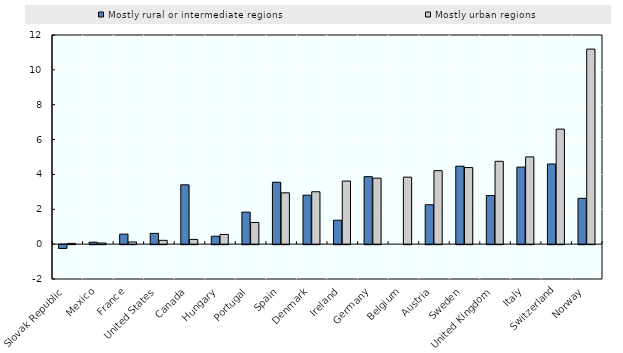
| Category | Mostly rural or intermediate regions | Mostly urban regions |
|---|---|---|
| Slovak Republic | -0.218 | 0.043 |
| Mexico | 0.111 | 0.065 |
| France | 0.574 | 0.125 |
| United States | 0.617 | 0.22 |
| Canada | 3.403 | 0.27 |
| Hungary | 0.454 | 0.557 |
| Portugal | 1.836 | 1.244 |
| Spain | 3.553 | 2.944 |
| Denmark | 2.809 | 3.005 |
| Ireland | 1.371 | 3.619 |
| Germany | 3.872 | 3.785 |
| Belgium | 0 | 3.844 |
| Austria | 2.261 | 4.217 |
| Sweden | 4.473 | 4.394 |
| United Kingdom | 2.79 | 4.753 |
| Italy | 4.42 | 5.007 |
| Switzerland | 4.598 | 6.6 |
| Norway | 2.629 | 11.191 |